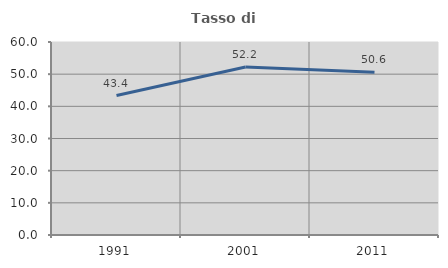
| Category | Tasso di occupazione   |
|---|---|
| 1991.0 | 43.353 |
| 2001.0 | 52.212 |
| 2011.0 | 50.574 |